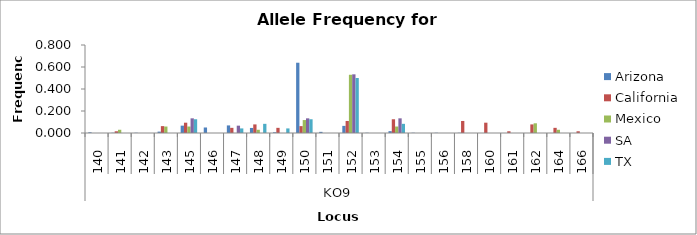
| Category | Arizona | California | Mexico | SA | TX |
|---|---|---|---|---|---|
| 0 | 0.006 | 0 | 0 | 0 | 0 |
| 1 | 0.002 | 0.016 | 0.029 | 0 | 0 |
| 2 | 0.002 | 0 | 0 | 0 | 0 |
| 3 | 0.013 | 0.062 | 0.059 | 0 | 0 |
| 4 | 0.067 | 0.094 | 0.059 | 0.133 | 0.125 |
| 5 | 0.05 | 0 | 0 | 0 | 0 |
| 6 | 0.069 | 0.047 | 0 | 0.067 | 0.042 |
| 7 | 0.046 | 0.078 | 0.029 | 0 | 0.083 |
| 8 | 0.006 | 0.047 | 0 | 0 | 0.042 |
| 9 | 0.639 | 0.062 | 0.118 | 0.133 | 0.125 |
| 10 | 0.01 | 0 | 0 | 0 | 0 |
| 11 | 0.065 | 0.109 | 0.529 | 0.533 | 0.5 |
| 12 | 0.002 | 0 | 0 | 0 | 0 |
| 13 | 0.017 | 0.125 | 0.059 | 0.133 | 0.083 |
| 14 | 0.002 | 0 | 0 | 0 | 0 |
| 15 | 0.002 | 0 | 0 | 0 | 0 |
| 16 | 0.002 | 0.109 | 0 | 0 | 0 |
| 17 | 0 | 0.094 | 0 | 0 | 0 |
| 18 | 0 | 0.016 | 0 | 0 | 0 |
| 19 | 0 | 0.078 | 0.088 | 0 | 0 |
| 20 | 0 | 0.047 | 0.029 | 0 | 0 |
| 21 | 0 | 0.016 | 0 | 0 | 0 |